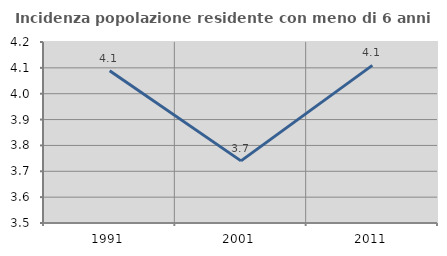
| Category | Incidenza popolazione residente con meno di 6 anni |
|---|---|
| 1991.0 | 4.089 |
| 2001.0 | 3.74 |
| 2011.0 | 4.11 |